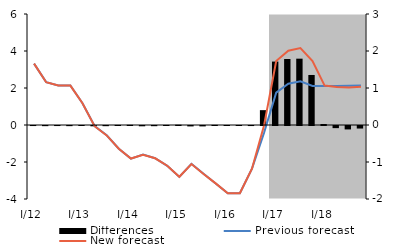
| Category | Differences |
|---|---|
| I/12 | -0.001 |
| II | -0.004 |
| III | -0.001 |
| IV | -0.004 |
| I/13 | -0.001 |
| II | -0.008 |
| III | -0.005 |
| IV | 0.002 |
| I/14 | 0.005 |
| II | -0.008 |
| III | -0.005 |
| IV | 0.001 |
| I/15 | 0.007 |
| II | -0.011 |
| III | -0.011 |
| IV | 0.003 |
| I/16 | 0 |
| II | 0 |
| III | -0.001 |
| IV | 0.401 |
| I/17 | 1.714 |
| II | 1.783 |
| III | 1.793 |
| IV | 1.352 |
| I/18 | 0.026 |
| II | -0.058 |
| III | -0.092 |
| IV | -0.068 |